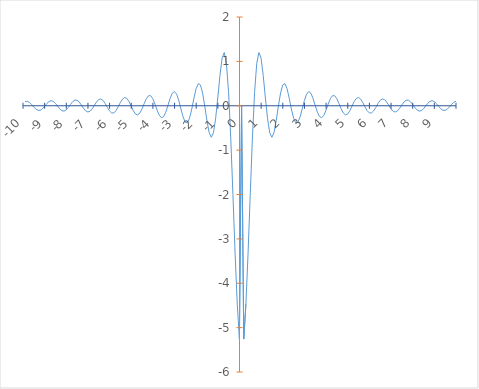
| Category | Series 0 |
|---|---|
| -10.0 | 0.093 |
| -9.9 | 0.1 |
| -9.8 | 0.076 |
| -9.7 | 0.03 |
| -9.6 | -0.027 |
| -9.5 | -0.077 |
| -9.4 | -0.104 |
| -9.3 | -0.101 |
| -9.2 | -0.067 |
| -9.1 | -0.012 |
| -9.0 | 0.047 |
| -8.9 | 0.094 |
| -8.8 | 0.114 |
| -8.7 | 0.099 |
| -8.6 | 0.054 |
| -8.5 | -0.008 |
| -8.4 | -0.069 |
| -8.3 | -0.111 |
| -8.2 | -0.12 |
| -8.1 | -0.094 |
| -8.0 | -0.038 |
| -7.9 | 0.031 |
| -7.8 | 0.092 |
| -7.699999999999999 | 0.127 |
| -7.6 | 0.124 |
| -7.5 | 0.084 |
| -7.4 | 0.017 |
| -7.3 | -0.057 |
| -7.199999999999999 | -0.115 |
| -7.1 | -0.141 |
| -7.0 | -0.124 |
| -6.9 | -0.069 |
| -6.8 | 0.008 |
| -6.699999999999999 | 0.085 |
| -6.6 | 0.139 |
| -6.5 | 0.152 |
| -6.4 | 0.12 |
| -6.3 | 0.05 |
| -6.199999999999999 | -0.037 |
| -6.1 | -0.116 |
| -6.0 | -0.162 |
| -5.8999999999999995 | -0.161 |
| -5.8 | -0.11 |
| -5.7 | -0.024 |
| -5.6 | 0.072 |
| -5.5 | 0.15 |
| -5.3999999999999995 | 0.185 |
| -5.3 | 0.165 |
| -5.199999999999999 | 0.094 |
| -5.1 | -0.008 |
| -5.0 | -0.112 |
| -4.8999999999999995 | -0.186 |
| -4.8 | -0.207 |
| -4.699999999999999 | -0.165 |
| -4.6 | -0.071 |
| -4.5 | 0.049 |
| -4.3999999999999995 | 0.159 |
| -4.3 | 0.226 |
| -4.199999999999999 | 0.227 |
| -4.1 | 0.158 |
| -4.0 | 0.038 |
| -3.8999999999999995 | -0.1 |
| -3.8 | -0.215 |
| -3.6999999999999993 | -0.27 |
| -3.5999999999999996 | -0.245 |
| -3.5 | -0.144 |
| -3.3999999999999995 | 0.008 |
| -3.3 | 0.166 |
| -3.1999999999999993 | 0.283 |
| -3.0999999999999996 | 0.32 |
| -3.0 | 0.261 |
| -2.8999999999999995 | 0.117 |
| -2.8 | -0.073 |
| -2.6999999999999993 | -0.255 |
| -2.5999999999999996 | -0.372 |
| -2.5 | -0.382 |
| -2.3999999999999995 | -0.275 |
| -2.3 | -0.072 |
| -2.1999999999999993 | 0.172 |
| -2.0999999999999996 | 0.385 |
| -2.0 | 0.499 |
| -1.9000000000000004 | 0.468 |
| -1.799999999999999 | 0.286 |
| -1.6999999999999993 | -0.008 |
| -1.5999999999999996 | -0.336 |
| -1.5 | -0.6 |
| -1.4000000000000004 | -0.71 |
| -1.299999999999999 | -0.609 |
| -1.1999999999999993 | -0.294 |
| -1.0999999999999996 | 0.175 |
| -1.0 | 0.68 |
| -0.9000000000000004 | 1.071 |
| -0.7999999999999989 | 1.2 |
| -0.6999999999999993 | 0.957 |
| -0.5999999999999996 | 0.298 |
| -0.5 | -0.73 |
| -0.3999999999999986 | -2 |
| -0.29999999999999893 | -3.32 |
| -0.1999999999999993 | -4.472 |
| -0.09999999999999964 | -5.258 |
| 0.0 | 0 |
| 0.10000000000000142 | -5.258 |
| 0.20000000000000107 | -4.472 |
| 0.3000000000000007 | -3.32 |
| 0.40000000000000036 | -2 |
| 0.5 | -0.73 |
| 0.6000000000000014 | 0.298 |
| 0.7000000000000011 | 0.957 |
| 0.8000000000000007 | 1.2 |
| 0.9000000000000004 | 1.071 |
| 1.0 | 0.68 |
| 1.1000000000000014 | 0.175 |
| 1.200000000000001 | -0.294 |
| 1.3000000000000007 | -0.609 |
| 1.4000000000000004 | -0.71 |
| 1.5 | -0.6 |
| 1.6000000000000014 | -0.336 |
| 1.700000000000001 | -0.008 |
| 1.8000000000000007 | 0.286 |
| 1.9000000000000004 | 0.468 |
| 2.0 | 0.499 |
| 2.1000000000000014 | 0.385 |
| 2.200000000000001 | 0.172 |
| 2.3000000000000007 | -0.072 |
| 2.4000000000000004 | -0.275 |
| 2.5 | -0.382 |
| 2.6000000000000014 | -0.372 |
| 2.700000000000001 | -0.255 |
| 2.8000000000000007 | -0.073 |
| 2.9000000000000004 | 0.117 |
| 3.0 | 0.261 |
| 3.1000000000000014 | 0.32 |
| 3.200000000000001 | 0.283 |
| 3.3000000000000007 | 0.166 |
| 3.4000000000000004 | 0.008 |
| 3.5 | -0.144 |
| 3.6000000000000014 | -0.245 |
| 3.700000000000001 | -0.27 |
| 3.8000000000000007 | -0.215 |
| 3.9000000000000004 | -0.1 |
| 4.0 | 0.038 |
| 4.100000000000001 | 0.158 |
| 4.200000000000001 | 0.227 |
| 4.300000000000001 | 0.226 |
| 4.4 | 0.159 |
| 4.5 | 0.049 |
| 4.600000000000001 | -0.071 |
| 4.700000000000001 | -0.165 |
| 4.800000000000001 | -0.207 |
| 4.9 | -0.186 |
| 5.0 | -0.112 |
| 5.100000000000001 | -0.008 |
| 5.200000000000001 | 0.094 |
| 5.300000000000001 | 0.165 |
| 5.4 | 0.185 |
| 5.5 | 0.15 |
| 5.600000000000001 | 0.072 |
| 5.700000000000001 | -0.024 |
| 5.800000000000001 | -0.11 |
| 5.9 | -0.161 |
| 6.0 | -0.162 |
| 6.100000000000001 | -0.116 |
| 6.199999999999999 | -0.037 |
| 6.300000000000001 | 0.05 |
| 6.400000000000002 | 0.12 |
| 6.5 | 0.152 |
| 6.600000000000001 | 0.139 |
| 6.699999999999999 | 0.085 |
| 6.800000000000001 | 0.008 |
| 6.900000000000002 | -0.069 |
| 7.0 | -0.124 |
| 7.100000000000001 | -0.141 |
| 7.199999999999999 | -0.115 |
| 7.300000000000001 | -0.057 |
| 7.400000000000002 | 0.017 |
| 7.5 | 0.084 |
| 7.600000000000001 | 0.124 |
| 7.699999999999999 | 0.127 |
| 7.800000000000001 | 0.092 |
| 7.900000000000002 | 0.031 |
| 8.0 | -0.038 |
| 8.100000000000001 | -0.094 |
| 8.2 | -0.12 |
| 8.3 | -0.111 |
| 8.400000000000002 | -0.069 |
| 8.5 | -0.008 |
| 8.600000000000001 | 0.054 |
| 8.7 | 0.099 |
| 8.8 | 0.114 |
| 8.900000000000002 | 0.094 |
| 9.0 | 0.047 |
| 9.100000000000001 | -0.012 |
| 9.200000000000003 | -0.067 |
| 9.3 | -0.101 |
| 9.400000000000002 | -0.104 |
| 9.5 | -0.077 |
| 9.600000000000001 | -0.027 |
| 9.700000000000003 | 0.03 |
| 9.8 | 0.076 |
| 9.900000000000002 | 0.1 |